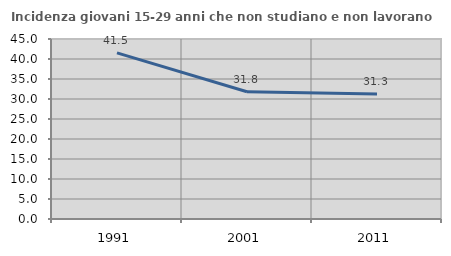
| Category | Incidenza giovani 15-29 anni che non studiano e non lavorano  |
|---|---|
| 1991.0 | 41.542 |
| 2001.0 | 31.818 |
| 2011.0 | 31.25 |